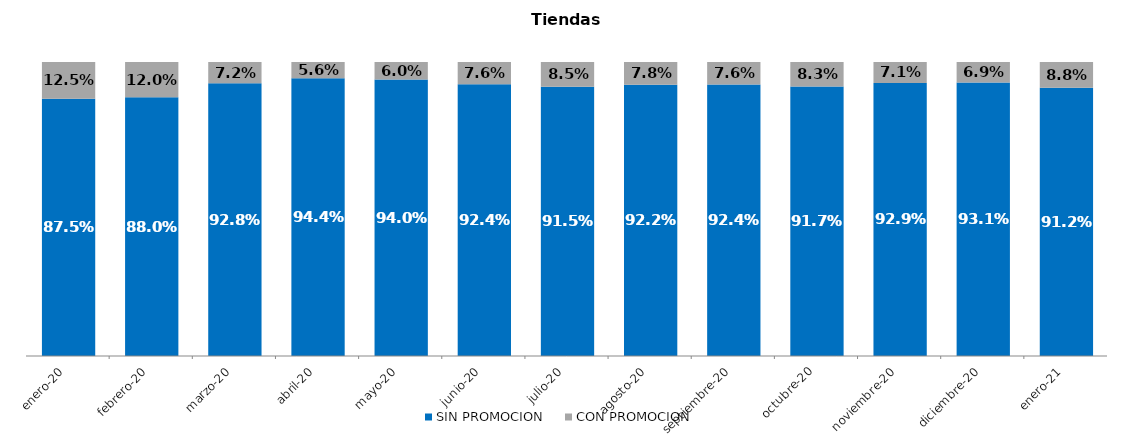
| Category | SIN PROMOCION   | CON PROMOCION   |
|---|---|---|
| 2020-01-01 | 0.875 | 0.125 |
| 2020-02-01 | 0.88 | 0.12 |
| 2020-03-01 | 0.928 | 0.072 |
| 2020-04-01 | 0.944 | 0.056 |
| 2020-05-01 | 0.94 | 0.06 |
| 2020-06-01 | 0.924 | 0.076 |
| 2020-07-01 | 0.915 | 0.085 |
| 2020-08-01 | 0.922 | 0.078 |
| 2020-09-01 | 0.924 | 0.076 |
| 2020-10-01 | 0.917 | 0.083 |
| 2020-11-01 | 0.929 | 0.071 |
| 2020-12-01 | 0.931 | 0.069 |
| 2021-01-01 | 0.912 | 0.088 |